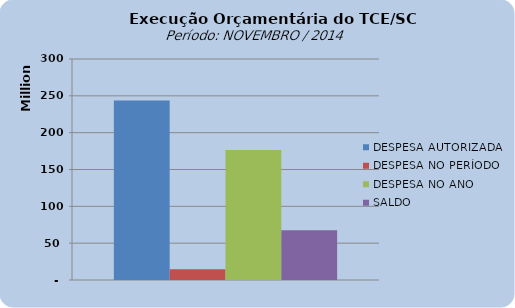
| Category | DESPESA AUTORIZADA | DESPESA NO PERÍODO | DESPESA NO ANO | SALDO |
|---|---|---|---|---|
| 0 | 243783088.09 | 14648266.17 | 176336768.21 | 67446319.88 |